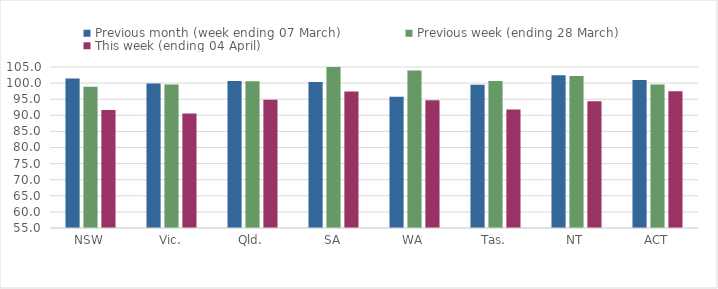
| Category | Previous month (week ending 07 March) | Previous week (ending 28 March) | This week (ending 04 April) |
|---|---|---|---|
| NSW | 101.419 | 98.859 | 91.663 |
| Vic. | 99.903 | 99.558 | 90.548 |
| Qld. | 100.679 | 100.595 | 94.839 |
| SA | 100.333 | 105.091 | 97.422 |
| WA | 95.743 | 103.897 | 94.705 |
| Tas. | 99.455 | 100.63 | 91.776 |
| NT | 102.415 | 102.229 | 94.38 |
| ACT | 100.989 | 99.557 | 97.461 |